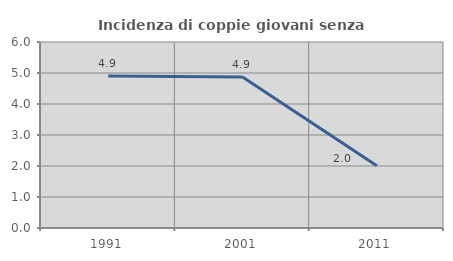
| Category | Incidenza di coppie giovani senza figli |
|---|---|
| 1991.0 | 4.899 |
| 2001.0 | 4.875 |
| 2011.0 | 2.009 |